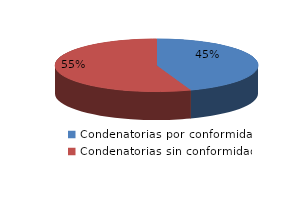
| Category | Series 0 |
|---|---|
| 0 | 893 |
| 1 | 1112 |